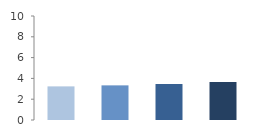
| Category | Rate (%) |
|---|---|
| 2009.0 | 3.232 |
| 2010.0 | 3.33 |
| 2011.0 | 3.459 |
| 2012.0 | 3.664 |